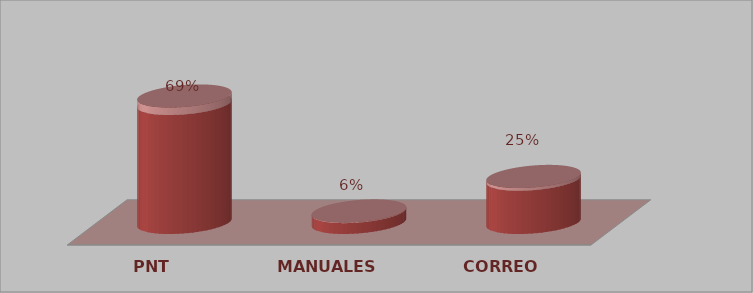
| Category | Series 0 | Series 1 |
|---|---|---|
| PNT | 11 | 0.688 |
| MANUALES | 1 | 0.062 |
| CORREO | 4 | 0.25 |